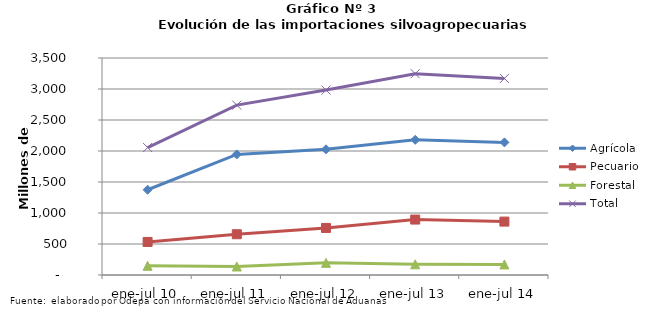
| Category | Agrícola | Pecuario | Forestal | Total |
|---|---|---|---|---|
| ene-jul 10 | 1375077 | 532836 | 148037 | 2055950 |
| ene-jul 11 | 1944930 | 657527 | 137225 | 2739682 |
| ene-jul 12 | 2027545 | 758841 | 196221 | 2982607 |
| ene-jul 13 | 2180496 | 894077 | 172296 | 3246869 |
| ene-jul 14 | 2138820 | 861169 | 170471 | 3170460 |